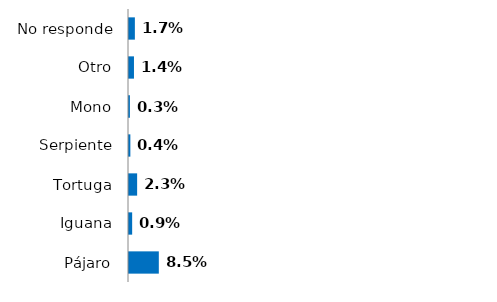
| Category | Series 0 |
|---|---|
| Pájaro | 0.085 |
| Iguana | 0.009 |
| Tortuga | 0.023 |
| Serpiente | 0.004 |
| Mono | 0.003 |
| Otro | 0.014 |
| No responde | 0.017 |